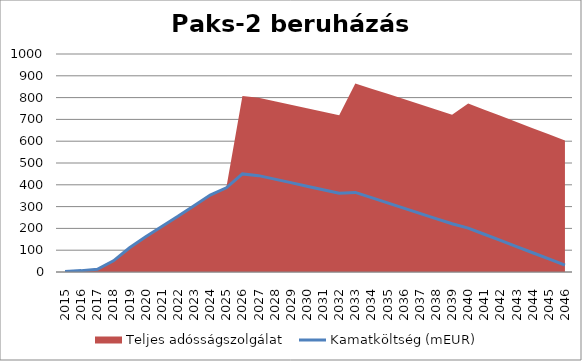
| Category | Kamatköltség (mEUR) |
|---|---|
| 2015.0 | 1.975 |
| 2016.0 | 6.32 |
| 2017.0 | 12.64 |
| 2018.0 | 51.35 |
| 2019.0 | 110.995 |
| 2020.0 | 161.555 |
| 2021.0 | 208.955 |
| 2022.0 | 255.368 |
| 2023.0 | 304.348 |
| 2024.0 | 353.13 |
| 2025.0 | 386.31 |
| 2026.0 | 450 |
| 2027.0 | 441.964 |
| 2028.0 | 425.893 |
| 2029.0 | 409.821 |
| 2030.0 | 393.75 |
| 2031.0 | 377.679 |
| 2032.0 | 361.607 |
| 2033.0 | 365.143 |
| 2034.0 | 341.143 |
| 2035.0 | 317.143 |
| 2036.0 | 293.143 |
| 2037.0 | 269.143 |
| 2038.0 | 245.143 |
| 2039.0 | 221.143 |
| 2040.0 | 201.536 |
| 2041.0 | 173.25 |
| 2042.0 | 144.964 |
| 2043.0 | 116.679 |
| 2044.0 | 88.393 |
| 2045.0 | 60.107 |
| 2046.0 | 31.821 |